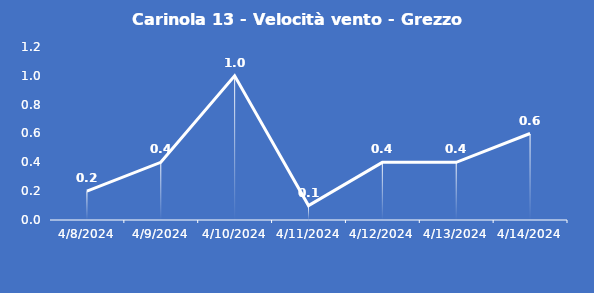
| Category | Carinola 13 - Velocità vento - Grezzo (m/s) |
|---|---|
| 4/8/24 | 0.2 |
| 4/9/24 | 0.4 |
| 4/10/24 | 1 |
| 4/11/24 | 0.1 |
| 4/12/24 | 0.4 |
| 4/13/24 | 0.4 |
| 4/14/24 | 0.6 |